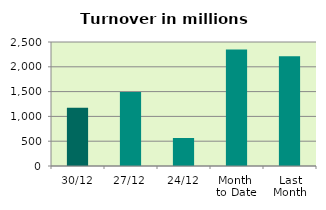
| Category | Series 0 |
|---|---|
| 30/12 | 1174.271 |
| 27/12 | 1492.543 |
| 24/12 | 564.701 |
| Month 
to Date | 2348.296 |
| Last
Month | 2210.602 |